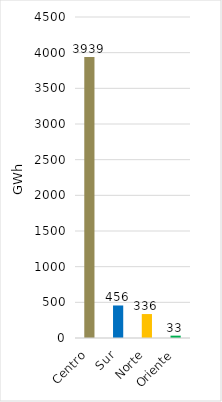
| Category | Series 0 |
|---|---|
| Centro | 3939.041 |
| Sur | 455.806 |
| Norte | 335.678 |
| Oriente | 32.971 |